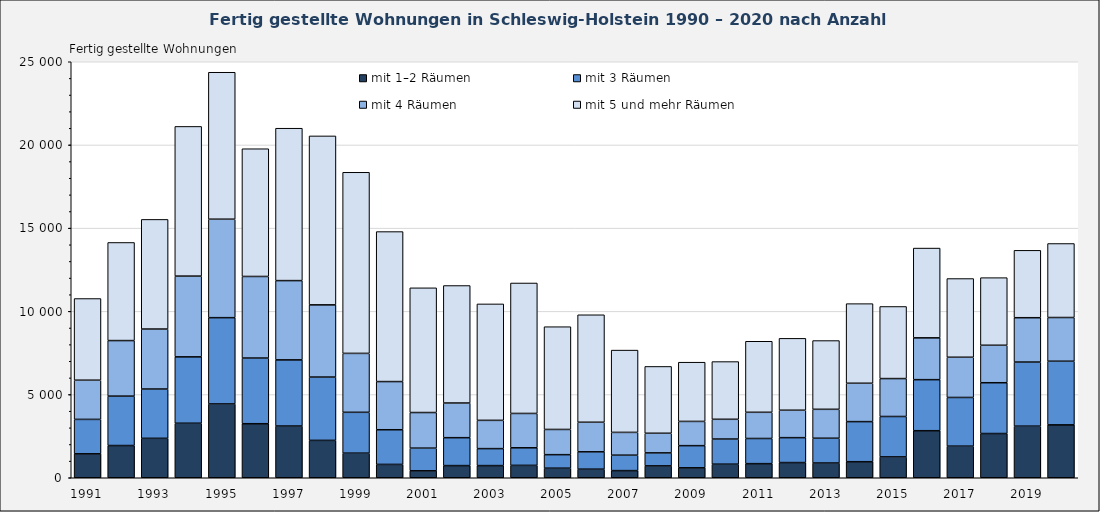
| Category | mit 1–2 Räumen | mit 3 Räumen | mit 4 Räumen | mit 5 und mehr Räumen |
|---|---|---|---|---|
| 1991.0 | 1439 | 2069 | 2355 | 4908 |
| 1992.0 | 1937 | 2969 | 3338 | 5896 |
| 1993.0 | 2370 | 2962 | 3605 | 6589 |
| 1994.0 | 3277 | 3989 | 4852 | 8996 |
| 1995.0 | 4435 | 5186 | 5917 | 8831 |
| 1996.0 | 3248 | 3946 | 4903 | 7676 |
| 1997.0 | 3109 | 3975 | 4764 | 9158 |
| 1998.0 | 2247 | 3804 | 4340 | 10152 |
| 1999.0 | 1478 | 2455 | 3541 | 10884 |
| 2000.0 | 802 | 2083 | 2895 | 9014 |
| 2001.0 | 417 | 1363 | 2140 | 7494 |
| 2002.0 | 731 | 1677 | 2084 | 7060 |
| 2003.0 | 731 | 1020 | 1698 | 6998 |
| 2004.0 | 745 | 1056 | 2063 | 7840 |
| 2005.0 | 575 | 812 | 1516 | 6175 |
| 2006.0 | 516 | 1043 | 1777 | 6458 |
| 2007.0 | 430 | 927 | 1369 | 4945 |
| 2008.0 | 713 | 781 | 1180 | 4016 |
| 2009.0 | 598 | 1331 | 1457 | 3558 |
| 2010.0 | 816 | 1510 | 1187 | 3469 |
| 2011.0 | 847 | 1512 | 1575 | 4269 |
| 2012.0 | 913 | 1497 | 1648 | 4320 |
| 2013.0 | 886 | 1489 | 1738 | 4132 |
| 2014.0 | 965 | 2408 | 2307 | 4784 |
| 2015.0 | 1253 | 2428 | 2279 | 4333 |
| 2016.0 | 2828 | 3067 | 2513 | 5395 |
| 2017.0 | 1899 | 2926 | 2417 | 4730 |
| 2018.0 | 2658 | 3053 | 2251 | 4063 |
| 2019.0 | 3101 | 3852 | 2665 | 4050 |
| 2020.0 | 3178 | 3826 | 2626 | 4447 |